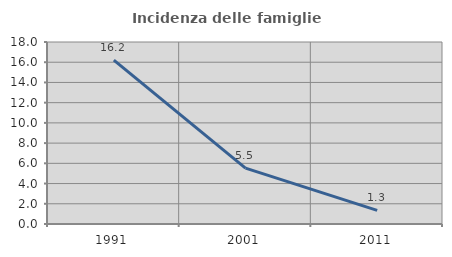
| Category | Incidenza delle famiglie numerose |
|---|---|
| 1991.0 | 16.201 |
| 2001.0 | 5.528 |
| 2011.0 | 1.345 |